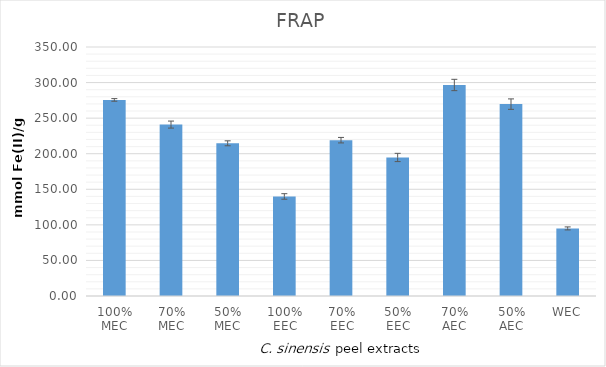
| Category | Series 0 |
|---|---|
| 100% MEC | 275.616 |
| 70% MEC | 240.939 |
| 50% MEC | 214.638 |
| 100% EEC | 139.938 |
| 70% EEC | 219.019 |
| 50% EEC | 194.731 |
| 70% AEC | 296.607 |
| 50% AEC | 269.711 |
| WEC | 94.997 |